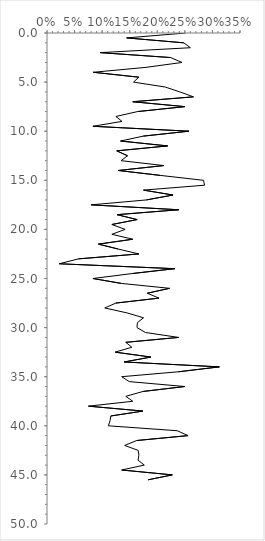
| Category | Series 0 |
|---|---|
| 0.25133689839572193 | 0 |
| 0.14444444444444443 | 0.5 |
| 0.24806201550387597 | 1 |
| 0.26 | 1.5 |
| 0.0963855421686747 | 2 |
| 0.22413793103448276 | 2.5 |
| 0.24489795918367346 | 3 |
| 0.1794871794871795 | 3.5 |
| 0.08396946564885496 | 4 |
| 0.16666666666666666 | 4.5 |
| 0.1568627450980392 | 5 |
| 0.21428571428571427 | 5.5 |
| 0.24096385542168675 | 6 |
| 0.265625 | 6.5 |
| 0.15555555555555556 | 7 |
| 0.25 | 7.5 |
| 0.1643835616438356 | 8 |
| 0.125 | 8.5 |
| 0.136 | 9 |
| 0.08333333333333333 | 9.5 |
| 0.25742574257425743 | 10 |
| 0.1746031746031746 | 10.5 |
| 0.13333333333333333 | 11 |
| 0.21875 | 11.5 |
| 0.12650602409638553 | 12 |
| 0.14606741573033707 | 12.5 |
| 0.13432835820895522 | 13 |
| 0.21176470588235294 | 13.5 |
| 0.12931034482758622 | 14 |
| 0.20512820512820512 | 14.5 |
| 0.28378378378378377 | 15 |
| 0.2857142857142857 | 15.5 |
| 0.175 | 16 |
| 0.22857142857142856 | 16.5 |
| 0.18 | 17 |
| 0.08 | 17.5 |
| 0.23880597014925373 | 18 |
| 0.12698412698412698 | 18.5 |
| 0.16346153846153846 | 19 |
| 0.11764705882352941 | 19.5 |
| 0.14173228346456693 | 20 |
| 0.11764705882352941 | 20.5 |
| 0.15555555555555556 | 21 |
| 0.09333333333333334 | 21.5 |
| 0.12903225806451613 | 22 |
| 0.16666666666666666 | 22.5 |
| 0.05714285714285714 | 23 |
| 0.022222222222222223 | 23.5 |
| 0.23170731707317074 | 24 |
| 0.15384615384615385 | 24.5 |
| 0.08333333333333333 | 25 |
| 0.1348314606741573 | 25.5 |
| 0.2222222222222222 | 26 |
| 0.18181818181818182 | 26.5 |
| 0.203125 | 27 |
| 0.125 | 27.5 |
| 0.10476190476190476 | 28 |
| 0.14482758620689656 | 28.5 |
| 0.175 | 29 |
| 0.16393442622950818 | 29.5 |
| 0.16326530612244897 | 30 |
| 0.17857142857142858 | 30.5 |
| 0.23863636363636365 | 31 |
| 0.14285714285714285 | 31.5 |
| 0.15384615384615385 | 32 |
| 0.12359550561797752 | 32.5 |
| 0.18840579710144928 | 33 |
| 0.14 | 33.5 |
| 0.3125 | 34 |
| 0.23809523809523808 | 34.5 |
| 0.13541666666666666 | 35 |
| 0.14925373134328357 | 35.5 |
| 0.25 | 36 |
| 0.1744186046511628 | 36.5 |
| 0.14285714285714285 | 37 |
| 0.15555555555555556 | 37.5 |
| 0.07518796992481203 | 38 |
| 0.17391304347826086 | 38.5 |
| 0.11578947368421053 | 39 |
| 0.11428571428571428 | 39.5 |
| 0.1111111111111111 | 40 |
| 0.2361111111111111 | 40.5 |
| 0.2558139534883721 | 41 |
| 0.16260162601626016 | 41.5 |
| 0.14084507042253522 | 42 |
| 0.1652892561983471 | 42.5 |
| 0.16666666666666666 | 43 |
| 0.1650485436893204 | 43.5 |
| 0.17647058823529413 | 44 |
| 0.13541666666666666 | 44.5 |
| 0.22727272727272727 | 45 |
| 0.18333333333333332 | 45.5 |